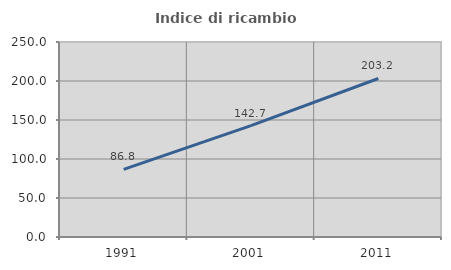
| Category | Indice di ricambio occupazionale  |
|---|---|
| 1991.0 | 86.765 |
| 2001.0 | 142.697 |
| 2011.0 | 203.226 |